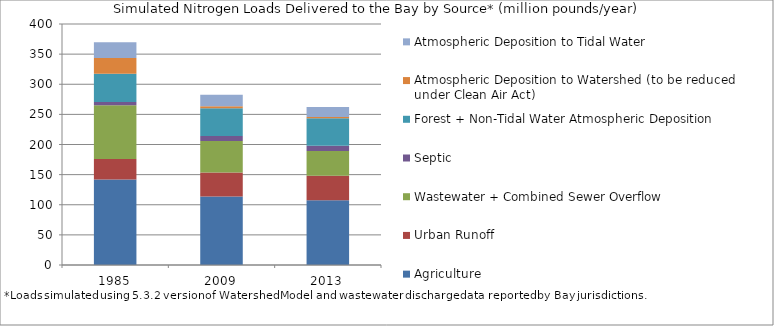
| Category | Agriculture | Urban Runoff | Wastewater + Combined Sewer Overflow | Septic | Forest + Non-Tidal Water Atmospheric Deposition | Atmospheric Deposition to Watershed (to be reduced under Clean Air Act) | Atmospheric Deposition to Tidal Water |
|---|---|---|---|---|---|---|---|
| 1985.0 | 141.822 | 34.235 | 89.183 | 5.157 | 47.189 | 26.117 | 26.08 |
| 2009.0 | 113.798 | 39.696 | 52.179 | 8.418 | 46.155 | 3.047 | 19.368 |
| 2013.0 | 107.376 | 40.758 | 40.884 | 8.751 | 45.815 | 1.897 | 16.899 |